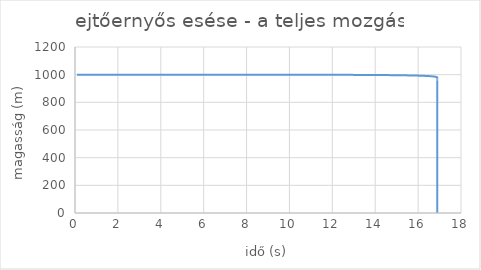
| Category | Series 0 |
|---|---|
| 0.09784999999999999 | 1000 |
| 0.19364145615175 | 1000 |
| 0.28746007160099024 | 1000 |
| 0.37938627144739057 | 1000 |
| 0.4694956294951315 | 1000 |
| 0.5578592525672859 | 1000 |
| 0.6445441273643155 | 1000 |
| 0.7296134341764717 | 1000 |
| 0.8131268311908 | 1000 |
| 0.8951407126488413 | 999.999 |
| 0.9757084436970991 | 999.999 |
| 1.0548805744175338 | 999.999 |
| 1.1327050352203816 | 999.999 |
| 1.2092273155186983 | 999.999 |
| 1.2844906273768006 | 999.999 |
| 1.358536055627824 | 999.999 |
| 1.4314026957844965 | 999.999 |
| 1.5031277809181567 | 999.998 |
| 1.5737467985508973 | 999.998 |
| 1.6432935984918067 | 999.998 |
| 1.711800492448377 | 999.998 |
| 1.7792983461563272 | 999.998 |
| 1.8458166646937435 | 999.998 |
| 1.9113836715771613 | 999.997 |
| 1.9760263821768473 | 999.997 |
| 2.0397706719350444 | 999.997 |
| 2.102641339823463 | 999.997 |
| 2.1646621674340842 | 999.996 |
| 2.225855974059738 | 999.996 |
| 2.286244668087353 | 999.996 |
| 2.345849294996809 | 999.996 |
| 2.4046900822314594 | 999.996 |
| 2.4627864811823486 | 999.995 |
| 2.520157206506535 | 999.995 |
| 2.5768202729805116 | 999.995 |
| 2.6327930300722184 | 999.994 |
| 2.688092194399391 | 999.994 |
| 2.7427338802277306 | 999.994 |
| 2.7967336281495254 | 999.994 |
| 2.850106432071698 | 999.993 |
| 2.9028667646316957 | 999.993 |
| 2.9550286011500657 | 999.993 |
| 3.006605442219837 | 999.992 |
| 3.0576103350249406 | 999.992 |
| 3.108055893472663 | 999.992 |
| 3.1579543172185853 | 999.991 |
| 3.2073174096564396 | 999.991 |
| 3.256156594939859 | 999.991 |
| 3.3044829340979707 | 999.99 |
| 3.3523071403022153 | 999.99 |
| 3.3996395933375605 | 999.989 |
| 3.4464903533274347 | 999.989 |
| 3.492869173758167 | 999.989 |
| 3.538785513845473 | 999.988 |
| 3.584248550282532 | 999.988 |
| 3.6292671884064642 | 999.987 |
| 3.6738500728174666 | 999.987 |
| 3.718005597482547 | 999.987 |
| 3.761741915353628 | 999.986 |
| 3.8050669475278034 | 999.986 |
| 3.847988391975706 | 999.985 |
| 3.890513731862215 | 999.985 |
| 3.9326502434821844 | 999.984 |
| 3.9744050038323984 | 999.984 |
| 4.015784897839612 | 999.983 |
| 4.056796625263278 | 999.983 |
| 4.0974467072904055 | 999.983 |
| 4.137741492838893 | 999.982 |
| 4.177687164584703 | 999.982 |
| 4.217289744727268 | 999.981 |
| 4.256555100506704 | 999.981 |
| 4.295488949485525 | 999.98 |
| 4.334096864606866 | 999.98 |
| 4.372384279040466 | 999.979 |
| 4.410356490827024 | 999.979 |
| 4.448018667330931 | 999.978 |
| 4.485375849510802 | 999.977 |
| 4.5224329560166785 | 999.977 |
| 4.559194787122312 | 999.976 |
| 4.595666028500412 | 999.976 |
| 4.6318512548483595 | 999.975 |
| 4.667754933371428 | 999.975 |
| 4.7033814271302 | 999.974 |
| 4.738734998258487 | 999.974 |
| 4.7738198110577255 | 999.973 |
| 4.8086399349735 | 999.972 |
| 4.8431993474595565 | 999.972 |
| 4.877501936734366 | 999.971 |
| 4.911551504435054 | 999.971 |
| 4.945351768173247 | 999.97 |
| 4.978906363997165 | 999.969 |
| 5.012218848764056 | 999.969 |
| 5.045292702426871 | 999.968 |
| 5.078131330238877 | 999.968 |
| 5.110738064879715 | 999.967 |
| 5.1431161685062525 | 999.966 |
| 5.1752688347313915 | 999.966 |
| 5.207199190533862 | 999.965 |
| 5.238910298101869 | 999.964 |
| 5.2704051566133225 | 999.964 |
| 5.3016867039552595 | 999.963 |
| 5.3327578183849305 | 999.962 |
| 5.363621320134916 | 999.962 |
| 5.394279972964526 | 999.961 |
| 5.424736485659616 | 999.96 |
| 5.454993513482882 | 999.96 |
| 5.485053659576573 | 999.959 |
| 5.514919476319491 | 999.958 |
| 5.544593466640057 | 999.957 |
| 5.574078085287134 | 999.957 |
| 5.603375740060234 | 999.956 |
| 5.632488793000665 | 999.955 |
| 5.6614195615450775 | 999.955 |
| 5.690170319642856 | 999.954 |
| 5.7187432988386835 | 999.953 |
| 5.747140689321586 | 999.952 |
| 5.775364640941701 | 999.952 |
| 5.803417264195939 | 999.951 |
| 5.831300631183693 | 999.95 |
| 5.859016776533669 | 999.949 |
| 5.88656769830289 | 999.948 |
| 5.913955358848857 | 999.948 |
| 5.941181685675842 | 999.947 |
| 5.968248572256213 | 999.946 |
| 5.995157878827681 | 999.945 |
| 6.021911433167304 | 999.945 |
| 6.048511031343069 | 999.944 |
| 6.074958438443812 | 999.943 |
| 6.101255389288232 | 999.942 |
| 6.127403589113718 | 999.941 |
| 6.15340471424566 | 999.94 |
| 6.1792604127479205 | 999.94 |
| 6.204972305055088 | 999.939 |
| 6.230541984587132 | 999.938 |
| 6.255971018347037 | 999.937 |
| 6.281260947501981 | 999.936 |
| 6.306413287948599 | 999.935 |
| 6.331429530862855 | 999.934 |
| 6.35631114323502 | 999.934 |
| 6.38105956839024 | 999.933 |
| 6.405676226495154 | 999.932 |
| 6.4301625150510135 | 999.931 |
| 6.454519809373731 | 999.93 |
| 6.478749463061272 | 999.929 |
| 6.502852808448782 | 999.928 |
| 6.526831157051854 | 999.927 |
| 6.550685799998272 | 999.926 |
| 6.574418008448625 | 999.925 |
| 6.598029034006108 | 999.925 |
| 6.621520109115852 | 999.924 |
| 6.6448924474541045 | 999.923 |
| 6.668147244307566 | 999.922 |
| 6.691285676943173 | 999.921 |
| 6.714308904968638 | 999.92 |
| 6.737218070683987 | 999.919 |
| 6.760014299424399 | 999.918 |
| 6.78269869989458 | 999.917 |
| 6.805272364494934 | 999.916 |
| 6.827736369639763 | 999.915 |
| 6.85009177606774 | 999.914 |
| 6.872339629144864 | 999.913 |
| 6.894480959160132 | 999.912 |
| 6.916516781614121 | 999.911 |
| 6.938448097500691 | 999.91 |
| 6.960275893582016 | 999.909 |
| 6.982001142657099 | 999.908 |
| 7.003624803824 | 999.907 |
| 7.025147822735911 | 999.906 |
| 7.046571131851285 | 999.905 |
| 7.067895650678152 | 999.904 |
| 7.0891222860128185 | 999.903 |
| 7.110251932173068 | 999.902 |
| 7.131285471226049 | 999.901 |
| 7.152223773210964 | 999.9 |
| 7.173067696356725 | 999.899 |
| 7.1938180872947 | 999.898 |
| 7.214475781266683 | 999.897 |
| 7.235041602328219 | 999.895 |
| 7.25551636354741 | 999.894 |
| 7.2759008671993115 | 999.893 |
| 7.296195904956052 | 999.892 |
| 7.316402258072775 | 999.891 |
| 7.336520697569519 | 999.89 |
| 7.3565519844091405 | 999.889 |
| 7.376496869671387 | 999.888 |
| 7.396356094723207 | 999.887 |
| 7.416130391385414 | 999.885 |
| 7.435820482095775 | 999.884 |
| 7.455427080068642 | 999.883 |
| 7.47495088945118 | 999.882 |
| 7.4943926054763175 | 999.881 |
| 7.513752914612466 | 999.88 |
| 7.533032494710114 | 999.879 |
| 7.552232015145365 | 999.877 |
| 7.57135213696049 | 999.876 |
| 7.590393513001584 | 999.875 |
| 7.609356788053379 | 999.874 |
| 7.628242598971302 | 999.873 |
| 7.647051574810829 | 999.872 |
| 7.665784336954218 | 999.87 |
| 7.684441499234663 | 999.869 |
| 7.7030236680579565 | 999.868 |
| 7.721531442521701 | 999.867 |
| 7.739965414532137 | 999.866 |
| 7.758326168918645 | 999.864 |
| 7.776614283545969 | 999.863 |
| 7.794830329424233 | 999.862 |
| 7.8129748708167766 | 999.861 |
| 7.831048465345888 | 999.859 |
| 7.849051664096465 | 999.858 |
| 7.86698501171766 | 999.857 |
| 7.884849046522558 | 999.856 |
| 7.902644300585923 | 999.854 |
| 7.92037129984007 | 999.853 |
| 7.938030564168904 | 999.852 |
| 7.955622607500149 | 999.851 |
| 7.973147937895843 | 999.849 |
| 7.990607057641102 | 999.848 |
| 8.008000463331223 | 999.847 |
| 8.025328645957137 | 999.845 |
| 8.042592090989269 | 999.844 |
| 8.059791278459835 | 999.843 |
| 8.076926683043606 | 999.842 |
| 8.093998774137173 | 999.84 |
| 8.111008015936756 | 999.839 |
| 8.12795486751458 | 999.838 |
| 8.144839782893852 | 999.836 |
| 8.161663211122372 | 999.835 |
| 8.1784255963448 | 999.834 |
| 8.195127377873622 | 999.832 |
| 8.211768990258829 | 999.831 |
| 8.228350863356345 | 999.829 |
| 8.244873422395232 | 999.828 |
| 8.261337088043685 | 999.827 |
| 8.277742276473866 | 999.825 |
| 8.294089399425582 | 999.824 |
| 8.310378864268834 | 999.823 |
| 8.326611074065278 | 999.821 |
| 8.34278642762859 | 999.82 |
| 8.358905319583796 | 999.818 |
| 8.374968140425548 | 999.817 |
| 8.390975276575404 | 999.816 |
| 8.406927110438112 | 999.814 |
| 8.422824020456925 | 999.813 |
| 8.438666381167964 | 999.811 |
| 8.454454563253648 | 999.81 |
| 8.47018893359522 | 999.808 |
| 8.48586985532437 | 999.807 |
| 8.501497687874002 | 999.806 |
| 8.51707278702811 | 999.804 |
| 8.532595504970859 | 999.803 |
| 8.548066190334797 | 999.801 |
| 8.563485188248302 | 999.8 |
| 8.57885284038221 | 999.798 |
| 8.594169484995676 | 999.797 |
| 8.609435456981291 | 999.795 |
| 8.624651087909431 | 999.794 |
| 8.639816706071892 | 999.792 |
| 8.65493263652481 | 999.791 |
| 8.669999201130873 | 999.789 |
| 8.685016718600847 | 999.788 |
| 8.699985504534439 | 999.786 |
| 8.714905871460482 | 999.785 |
| 8.729778128876488 | 999.783 |
| 8.74460258328755 | 999.782 |
| 8.75937953824464 | 999.78 |
| 8.774109294382278 | 999.779 |
| 8.788792149455608 | 999.777 |
| 8.80342839837689 | 999.776 |
| 8.81801833325141 | 999.774 |
| 8.832562243412825 | 999.773 |
| 8.84706041545795 | 999.771 |
| 8.861513133281006 | 999.769 |
| 8.875920678107331 | 999.768 |
| 8.890283328526564 | 999.766 |
| 8.904601360525318 | 999.765 |
| 8.918875047519336 | 999.763 |
| 8.933104660385172 | 999.761 |
| 8.947290467491369 | 999.76 |
| 8.961432734729158 | 999.758 |
| 8.9755317255427 | 999.757 |
| 8.989587700958856 | 999.755 |
| 9.003600919616513 | 999.753 |
| 9.017571637795463 | 999.752 |
| 9.03150010944484 | 999.75 |
| 9.04538658621114 | 999.749 |
| 9.059231317465816 | 999.747 |
| 9.073034550332451 | 999.745 |
| 9.086796529713547 | 999.744 |
| 9.100517498316893 | 999.742 |
| 9.114197696681558 | 999.74 |
| 9.127837363203488 | 999.739 |
| 9.141436734160738 | 999.737 |
| 9.154996043738326 | 999.735 |
| 9.168515524052719 | 999.734 |
| 9.181995405175972 | 999.732 |
| 9.195435915159505 | 999.73 |
| 9.208837280057546 | 999.729 |
| 9.22219972395022 | 999.727 |
| 9.23552346896632 | 999.725 |
| 9.248808735305737 | 999.723 |
| 9.262055741261577 | 999.722 |
| 9.275264703241959 | 999.72 |
| 9.288435835791502 | 999.718 |
| 9.3015693516125 | 999.717 |
| 9.31466546158581 | 999.715 |
| 9.327724374791428 | 999.713 |
| 9.340746298528794 | 999.711 |
| 9.35373143833679 | 999.71 |
| 9.366679998013478 | 999.708 |
| 9.379592179635539 | 999.706 |
| 9.392468183577465 | 999.704 |
| 9.405308208530473 | 999.702 |
| 9.418112451521145 | 999.701 |
| 9.430881107929833 | 999.699 |
| 9.443614371508797 | 999.697 |
| 9.456312434400086 | 999.695 |
| 9.468975487153195 | 999.694 |
| 9.481603718742457 | 999.692 |
| 9.49419731658422 | 999.69 |
| 9.506756466553767 | 999.688 |
| 9.51928135300203 | 999.686 |
| 9.531772158772059 | 999.684 |
| 9.544229065215275 | 999.683 |
| 9.556652252207513 | 999.681 |
| 9.569041898164835 | 999.679 |
| 9.581398180059143 | 999.677 |
| 9.593721273433573 | 999.675 |
| 9.606011352417696 | 999.673 |
| 9.618268589742504 | 999.672 |
| 9.630493156755215 | 999.67 |
| 9.64268522343386 | 999.668 |
| 9.6548449584017 | 999.666 |
| 9.666972528941438 | 999.664 |
| 9.679068101009246 | 999.662 |
| 9.691131839248627 | 999.66 |
| 9.703163907004063 | 999.658 |
| 9.715164466334523 | 999.657 |
| 9.727133678026764 | 999.655 |
| 9.739071701608482 | 999.653 |
| 9.75097869536128 | 999.651 |
| 9.762854816333475 | 999.649 |
| 9.77470022035274 | 999.647 |
| 9.786515062038585 | 999.645 |
| 9.798299494814678 | 999.643 |
| 9.810053670921006 | 999.641 |
| 9.821777741425883 | 999.639 |
| 9.833471856237814 | 999.637 |
| 9.845136164117195 | 999.635 |
| 9.856770812687872 | 999.633 |
| 9.868375948448564 | 999.631 |
| 9.879951716784126 | 999.629 |
| 9.89149826197668 | 999.627 |
| 9.903015727216612 | 999.625 |
| 9.91450425461342 | 999.624 |
| 9.925963985206433 | 999.622 |
| 9.937395058975408 | 999.62 |
| 9.948797614850973 | 999.618 |
| 9.960171790724964 | 999.616 |
| 9.97151772346062 | 999.614 |
| 9.982835548902662 | 999.612 |
| 9.994125401887242 | 999.609 |
| 10.005387416251777 | 999.607 |
| 10.016621724844656 | 999.605 |
| 10.027828459534836 | 999.603 |
| 10.03900775122132 | 999.601 |
| 10.050159729842514 | 999.599 |
| 10.061284524385487 | 999.597 |
| 10.072382262895093 | 999.595 |
| 10.08345307248302 | 999.593 |
| 10.094497079336692 | 999.591 |
| 10.105514408728098 | 999.589 |
| 10.11650518502249 | 999.587 |
| 10.127469531686998 | 999.585 |
| 10.138407571299128 | 999.583 |
| 10.149319425555168 | 999.581 |
| 10.160205215278493 | 999.579 |
| 10.171065060427768 | 999.577 |
| 10.181899080105064 | 999.574 |
| 10.192707392563866 | 999.572 |
| 10.203490115217003 | 999.57 |
| 10.21424736464447 | 999.568 |
| 10.22497925660117 | 999.566 |
| 10.235685906024566 | 999.564 |
| 10.246367427042234 | 999.562 |
| 10.257023932979338 | 999.56 |
| 10.267655536366023 | 999.557 |
| 10.278262348944708 | 999.555 |
| 10.288844481677307 | 999.553 |
| 10.299402044752371 | 999.551 |
| 10.309935147592132 | 999.549 |
| 10.320443898859484 | 999.547 |
| 10.330928406464876 | 999.544 |
| 10.341388777573126 | 999.542 |
| 10.351825118610165 | 999.54 |
| 10.3622375352697 | 999.538 |
| 10.372626132519793 | 999.536 |
| 10.382991014609392 | 999.533 |
| 10.393332285074758 | 999.531 |
| 10.403650046745843 | 999.529 |
| 10.413944401752586 | 999.527 |
| 10.424215451531138 | 999.525 |
| 10.43446329683003 | 999.522 |
| 10.444688037716253 | 999.52 |
| 10.45488977358129 | 999.518 |
| 10.465068603147069 | 999.516 |
| 10.475224624471858 | 999.513 |
| 10.485357934956092 | 999.511 |
| 10.495468631348132 | 999.509 |
| 10.505556809749969 | 999.507 |
| 10.51562256562286 | 999.504 |
| 10.525665993792908 | 999.502 |
| 10.535687188456576 | 999.5 |
| 10.545686243186145 | 999.498 |
| 10.555663250935108 | 999.495 |
| 10.565618304043513 | 999.493 |
| 10.575551494243243 | 999.491 |
| 10.585462912663242 | 999.488 |
| 10.595352649834686 | 999.486 |
| 10.605220795696091 | 999.484 |
| 10.61506743959838 | 999.482 |
| 10.624892670309883 | 999.479 |
| 10.634696576021293 | 999.477 |
| 10.644479244350562 | 999.475 |
| 10.654240762347753 | 999.472 |
| 10.663981216499835 | 999.47 |
| 10.673700692735428 | 999.468 |
| 10.683399276429505 | 999.465 |
| 10.693077052408032 | 999.463 |
| 10.702734104952574 | 999.46 |
| 10.712370517804839 | 999.458 |
| 10.721986374171186 | 999.456 |
| 10.73158175672708 | 999.453 |
| 10.741156747621503 | 999.451 |
| 10.750711428481315 | 999.449 |
| 10.760245880415582 | 999.446 |
| 10.76976018401984 | 999.444 |
| 10.779254419380333 | 999.441 |
| 10.788728666078205 | 999.439 |
| 10.798183003193634 | 999.437 |
| 10.807617509309939 | 999.434 |
| 10.817032262517644 | 999.432 |
| 10.826427340418496 | 999.429 |
| 10.83580282012944 | 999.427 |
| 10.845158778286558 | 999.425 |
| 10.854495291048975 | 999.422 |
| 10.863812434102703 | 999.42 |
| 10.873110282664477 | 999.417 |
| 10.882388911485526 | 999.415 |
| 10.891648394855322 | 999.412 |
| 10.900888806605284 | 999.41 |
| 10.91011022011245 | 999.407 |
| 10.919312708303108 | 999.405 |
| 10.92849634365639 | 999.402 |
| 10.937661198207836 | 999.4 |
| 10.946807343552925 | 999.397 |
| 10.955934850850552 | 999.395 |
| 10.965043790826497 | 999.392 |
| 10.974134233776844 | 999.39 |
| 10.983206249571367 | 999.387 |
| 10.992259907656889 | 999.385 |
| 11.0012952770606 | 999.382 |
| 11.01031242639335 | 999.38 |
| 11.019311423852912 | 999.377 |
| 11.0282923372272 | 999.375 |
| 11.037255233897469 | 999.372 |
| 11.046200180841478 | 999.37 |
| 11.055127244636624 | 999.367 |
| 11.064036491463048 | 999.365 |
| 11.072927987106702 | 999.362 |
| 11.081801796962399 | 999.36 |
| 11.090657986036826 | 999.357 |
| 11.099496618951527 | 999.354 |
| 11.108317759945868 | 999.352 |
| 11.117121472879957 | 999.349 |
| 11.12590782123755 | 999.347 |
| 11.134676868128928 | 999.344 |
| 11.143428676293738 | 999.341 |
| 11.152163308103814 | 999.339 |
| 11.160880825565973 | 999.336 |
| 11.169581290324778 | 999.334 |
| 11.178264763665283 | 999.331 |
| 11.186931306515742 | 999.328 |
| 11.195580979450305 | 999.326 |
| 11.20421384269168 | 999.323 |
| 11.212829956113767 | 999.321 |
| 11.221429379244286 | 999.318 |
| 11.230012171267356 | 999.315 |
| 11.238578391026065 | 999.313 |
| 11.247128097025016 | 999.31 |
| 11.255661347432842 | 999.307 |
| 11.264178200084707 | 999.305 |
| 11.272678712484776 | 999.302 |
| 11.281162941808667 | 999.299 |
| 11.289630944905875 | 999.297 |
| 11.298082778302186 | 999.294 |
| 11.306518498202054 | 999.291 |
| 11.314938160490968 | 999.289 |
| 11.323341820737785 | 999.286 |
| 11.33172953419706 | 999.283 |
| 11.340101355811337 | 999.28 |
| 11.348457340213429 | 999.278 |
| 11.356797541728676 | 999.275 |
| 11.36512201437718 | 999.272 |
| 11.373430811876021 | 999.27 |
| 11.38172398764146 | 999.267 |
| 11.390001594791105 | 999.264 |
| 11.39826368614608 | 999.261 |
| 11.406510314233158 | 999.259 |
| 11.414741531286877 | 999.256 |
| 11.422957389251648 | 999.253 |
| 11.431157939783832 | 999.25 |
| 11.511637838884372 | 999.222 |
| 11.590642755172807 | 999.194 |
| 11.668220569414597 | 999.165 |
| 11.744416609537813 | 999.135 |
| 11.819273824472308 | 999.105 |
| 11.892832943628157 | 999.075 |
| 11.965132623433588 | 999.044 |
| 12.03620958219068 | 999.012 |
| 12.106098724365872 | 998.98 |
| 12.174833255308894 | 998.948 |
| 12.24244478728553 | 998.915 |
| 12.308963437614754 | 998.882 |
| 12.374417919617162 | 998.848 |
| 12.43883562700807 | 998.813 |
| 12.502242712303508 | 998.779 |
| 12.564664159749883 | 998.743 |
| 12.626123853236987 | 998.708 |
| 12.686644639608735 | 998.672 |
| 12.746248387745768 | 998.635 |
| 12.804956043758077 | 998.598 |
| 12.862787682593847 | 998.561 |
| 12.919762556342052 | 998.523 |
| 12.97589913948076 | 998.484 |
| 13.031215171300158 | 998.446 |
| 13.085727695708735 | 998.406 |
| 13.139453098612575 | 998.367 |
| 13.192407143041105 | 998.327 |
| 13.24460500217768 | 998.286 |
| 13.29606129043993 | 998.245 |
| 13.346790092742602 | 998.204 |
| 13.396804992064673 | 998.162 |
| 13.446119095432596 | 998.12 |
| 13.494745058422522 | 998.077 |
| 13.54269510827627 | 998.034 |
| 13.58998106571837 | 997.991 |
| 13.636614365554884 | 997.947 |
| 13.68260607612858 | 997.903 |
| 13.727966917699538 | 997.858 |
| 13.772707279815211 | 997.813 |
| 13.816837237729423 | 997.768 |
| 13.860366567925542 | 997.722 |
| 13.903304762795313 | 997.676 |
| 13.945661044521298 | 997.629 |
| 13.987444378207684 | 997.582 |
| 14.028663484301328 | 997.535 |
| 14.069326850342152 | 997.488 |
| 14.109442742079603 | 997.44 |
| 14.14901921398956 | 997.391 |
| 14.188064119224022 | 997.343 |
| 14.226585119023948 | 997.293 |
| 14.264589691623845 | 997.244 |
| 14.302085140675045 | 997.194 |
| 14.33907860321308 | 997.144 |
| 14.375577057193144 | 997.094 |
| 14.411587328616289 | 997.043 |
| 14.447116098267792 | 996.992 |
| 14.482169908087968 | 996.941 |
| 14.516755167194624 | 996.889 |
| 14.55087815757535 | 996.837 |
| 14.584545039466898 | 996.785 |
| 14.617761856438019 | 996.732 |
| 14.650534540191272 | 996.68 |
| 14.682868915098569 | 996.626 |
| 14.714770702484461 | 996.573 |
| 14.74624552467048 | 996.519 |
| 14.777298908793162 | 996.465 |
| 14.80793629040782 | 996.411 |
| 14.838163016889474 | 996.356 |
| 14.867984350641816 | 996.301 |
| 14.89740547212457 | 996.246 |
| 14.92643148270907 | 996.191 |
| 14.955067407371422 | 996.135 |
| 14.98331819723214 | 996.08 |
| 15.011188731950753 | 996.023 |
| 15.038683821983383 | 995.967 |
| 15.065808210711005 | 995.91 |
| 15.092566576445625 | 995.854 |
| 15.118963534321326 | 995.797 |
| 15.14500363807674 | 995.739 |
| 15.17069138173521 | 995.682 |
| 15.19603120118856 | 995.624 |
| 15.221027475690134 | 995.566 |
| 15.24568452926244 | 995.508 |
| 15.270006632024495 | 995.449 |
| 15.293998001443667 | 995.391 |
| 15.31766280351662 | 995.332 |
| 15.341005153883676 | 995.273 |
| 15.364029118880696 | 995.214 |
| 15.386738716532394 | 995.155 |
| 15.409137917490755 | 995.095 |
| 15.431230645922048 | 995.035 |
| 15.45302078034573 | 994.975 |
| 15.474512154428377 | 994.915 |
| 15.495708557735563 | 994.855 |
| 15.516613736444505 | 994.794 |
| 15.537231394020072 | 994.734 |
| 15.557565191856664 | 994.673 |
| 15.57761874988829 | 994.612 |
| 15.597395647169044 | 994.551 |
| 15.616899422426066 | 994.49 |
| 15.636133574586932 | 994.428 |
| 15.655101563283324 | 994.367 |
| 15.673806809332692 | 994.305 |
| 15.692252695199535 | 994.243 |
| 15.710442565437837 | 994.181 |
| 15.728379727116062 | 994.119 |
| 15.74606745022606 | 994.057 |
| 15.763508968077138 | 993.994 |
| 15.780707477676465 | 993.932 |
| 15.797666140096888 | 993.869 |
| 15.814388080833218 | 993.806 |
| 15.830876390147898 | 993.743 |
| 15.847134123406969 | 993.68 |
| 15.863164301407151 | 993.617 |
| 15.878969910694808 | 993.554 |
| 15.894553903877501 | 993.49 |
| 15.909919199928808 | 993.427 |
| 15.925068684487014 | 993.363 |
| 15.94000521014823 | 993.3 |
| 15.954731596754478 | 993.236 |
| 15.969250631677205 | 993.172 |
| 15.983565070096706 | 993.108 |
| 15.997677635277805 | 993.044 |
| 16.011591018842232 | 992.98 |
| 16.025307881037985 | 992.915 |
| 16.03883085100602 | 992.851 |
| 16.05216252704453 | 992.786 |
| 16.06530547687111 | 992.722 |
| 16.078262237882978 | 992.657 |
| 16.09103531741552 | 992.592 |
| 16.103627192999326 | 992.528 |
| 16.11604031261587 | 992.463 |
| 16.128277094952004 | 992.398 |
| 16.14033992965341 | 992.333 |
| 16.15223117757709 | 992.268 |
| 16.163953171043016 | 992.202 |
| 16.175508214085053 | 992.137 |
| 16.18689858270118 | 992.072 |
| 16.198126525103113 | 992.006 |
| 16.209194261965376 | 991.941 |
| 16.22010398667383 | 991.875 |
| 16.230857865573757 | 991.81 |
| 16.24145803821746 | 991.744 |
| 16.251906617611436 | 991.678 |
| 16.262205690463123 | 991.613 |
| 16.272357317427215 | 991.547 |
| 16.282363533351567 | 991.481 |
| 16.292226347522664 | 991.415 |
| 16.301947743910638 | 991.349 |
| 16.311529681413845 | 991.283 |
| 16.320974094102954 | 991.217 |
| 16.330282891464545 | 991.151 |
| 16.339457958644175 | 991.084 |
| 16.348501156688908 | 991.018 |
| 16.357414322789236 | 990.952 |
| 16.366199270520422 | 990.885 |
| 16.37485779008316 | 990.819 |
| 16.383391648543576 | 990.753 |
| 16.391802590072505 | 990.686 |
| 16.40009233618401 | 990.62 |
| 16.408262585973105 | 990.553 |
| 16.41631501635265 | 990.486 |
| 16.424251282289394 | 990.42 |
| 16.43207301703906 | 990.353 |
| 16.43978183238055 | 990.286 |
| 16.447379318849123 | 990.22 |
| 16.45486704596855 | 990.153 |
| 16.462246562482242 | 990.086 |
| 16.469519396583237 | 990.019 |
| 16.4766870561431 | 989.952 |
| 16.48375102893961 | 989.885 |
| 16.490712782883293 | 989.818 |
| 16.497573766242667 | 989.751 |
| 16.50433540786826 | 989.684 |
| 16.510999117415306 | 989.617 |
| 16.517566285565092 | 989.55 |
| 16.524038284244988 | 989.483 |
| 16.530416466847036 | 989.416 |
| 16.536702168445153 | 989.349 |
| 16.542896706010865 | 989.281 |
| 16.54900137862758 | 989.214 |
| 16.555017467703365 | 989.147 |
| 16.560946237182197 | 989.08 |
| 16.56678893375367 | 989.012 |
| 16.572546787061146 | 988.945 |
| 16.578221009908315 | 988.878 |
| 16.58381279846415 | 988.81 |
| 16.589323332466257 | 988.743 |
| 16.59475377542256 | 988.676 |
| 16.600105274811362 | 988.608 |
| 16.605378962279723 | 988.541 |
| 16.610575953840158 | 988.473 |
| 16.615697350065645 | 988.406 |
| 16.620744236282935 | 988.338 |
| 16.625717682764133 | 988.271 |
| 16.63061874491657 | 988.203 |
| 16.63544846347094 | 988.136 |
| 16.64020786466768 | 988.068 |
| 16.644897960441632 | 988.001 |
| 16.649519748604945 | 987.933 |
| 16.65407421302821 | 987.865 |
| 16.658562323819847 | 987.798 |
| 16.662985037503727 | 987.73 |
| 16.667343297195032 | 987.663 |
| 16.67163803277435 | 987.595 |
| 16.67587016106 | 987.527 |
| 16.680040585978595 | 987.46 |
| 16.684150198733843 | 987.392 |
| 16.688199877973574 | 987.324 |
| 16.692190489955028 | 987.256 |
| 16.696122888708366 | 987.189 |
| 16.699997916198438 | 987.121 |
| 16.703816402484794 | 987.053 |
| 16.707579165879956 | 986.985 |
| 16.711287013105952 | 986.918 |
| 16.71494073944912 | 986.85 |
| 16.718541128913163 | 986.782 |
| 16.722088954370523 | 986.714 |
| 16.725584977712 | 986.646 |
| 16.7290299499947 | 986.578 |
| 16.73242461158827 | 986.511 |
| 16.735769692319447 | 986.443 |
| 16.739065911614922 | 986.375 |
| 16.74231397864256 | 986.307 |
| 16.745514592450924 | 986.239 |
| 16.748668442107178 | 986.171 |
| 16.751776206833338 | 986.103 |
| 16.754838556140893 | 986.035 |
| 16.75785614996382 | 985.967 |
| 16.760829638789982 | 985.9 |
| 16.76375966379092 | 985.832 |
| 16.766646856950103 | 985.764 |
| 16.76949184118955 | 985.696 |
| 16.772295230494937 | 985.628 |
| 16.775057630039143 | 985.56 |
| 16.777779636304256 | 985.492 |
| 16.780461837202058 | 985.424 |
| 16.78310481219301 | 985.356 |
| 16.78570913240373 | 985.288 |
| 16.788275360743 | 985.22 |
| 16.790804052016284 | 985.152 |
| 16.79329575303881 | 985.084 |
| 16.795751002747192 | 985.016 |
| 16.79817033230964 | 984.948 |
| 16.800554265234727 | 984.88 |
| 16.802903317478783 | 984.812 |
| 16.805217997551875 | 984.744 |
| 16.807498806622423 | 984.676 |
| 16.809746238620455 | 984.608 |
| 16.81196078033951 | 984.54 |
| 16.8141429115372 | 984.472 |
| 16.816293105034465 | 984.404 |
| 16.81841182681351 | 984.336 |
| 16.82049953611445 | 984.268 |
| 16.822556685530685 | 984.2 |
| 16.824583721102986 | 984.132 |
| 16.826581082412357 | 984.063 |
| 16.82854920267164 | 983.995 |
| 16.830488508815893 | 983.927 |
| 16.832399421591575 | 983.859 |
| 16.834282355644508 | 983.791 |
| 16.836137719606675 | 983.723 |
| 16.837965916181833 | 983.655 |
| 16.839767342229983 | 983.587 |
| 16.841542388850677 | 983.519 |
| 16.843291441465205 | 983.451 |
| 16.845014879897676 | 983.383 |
| 16.84671307845496 | 983.315 |
| 16.84838640600558 | 983.246 |
| 16.85003522605749 | 983.178 |
| 16.8516598968348 | 983.11 |
| 16.85326077135347 | 983.042 |
| 16.854838197495912 | 982.974 |
| 16.85639251808463 | 982.906 |
| 16.857924070954777 | 982.838 |
| 16.859433189025772 | 982.77 |
| 16.86092020037188 | 982.702 |
| 16.86238542829183 | 982.633 |
| 16.863829191377487 | 982.565 |
| 16.86525180358153 | 982.497 |
| 16.866653574284218 | 982.429 |
| 16.86803480835923 | 982.361 |
| 16.86939580623856 | 982.293 |
| 16.870736863976525 | 982.225 |
| 16.888668746832217 | 978.814 |
| 16.893449693440324 | 975.404 |
| 16.894726060648168 | 971.994 |
| 16.895066599666276 | 968.584 |
| 16.89515748295717 | 965.174 |
| 16.89518173467345 | 961.764 |
| 16.895188206521286 | 958.354 |
| 16.895189933557116 | 954.944 |
| 16.895190394429147 | 951.534 |
| 16.8951905174154 | 948.124 |
| 16.895190550235064 | 944.714 |
| 16.895190558993185 | 941.304 |
| 16.895190561330345 | 937.894 |
| 16.89519056195403 | 934.484 |
| 16.895190562120465 | 931.074 |
| 16.895190562164878 | 927.664 |
| 16.89519056217673 | 924.254 |
| 16.89519056217989 | 920.845 |
| 16.895190562180737 | 917.435 |
| 16.89519056218096 | 914.025 |
| 16.89519056218102 | 910.615 |
| 16.89519056218104 | 907.205 |
| 16.895190562181043 | 903.795 |
| 16.895190562181043 | 900.385 |
| 16.895190562181043 | 896.975 |
| 16.895190562181043 | 893.565 |
| 16.895190562181043 | 890.155 |
| 16.895190562181043 | 886.745 |
| 16.895190562181043 | 883.335 |
| 16.895190562181043 | 879.925 |
| 16.895190562181043 | 876.515 |
| 16.895190562181043 | 873.105 |
| 16.895190562181043 | 869.695 |
| 16.895190562181043 | 866.285 |
| 16.895190562181043 | 862.875 |
| 16.895190562181043 | 859.465 |
| 16.895190562181043 | 856.055 |
| 16.895190562181043 | 852.645 |
| 16.895190562181043 | 849.235 |
| 16.895190562181043 | 845.825 |
| 16.895190562181043 | 842.415 |
| 16.895190562181043 | 839.005 |
| 16.895190562181043 | 835.595 |
| 16.895190562181043 | 832.185 |
| 16.895190562181043 | 828.775 |
| 16.895190562181043 | 825.365 |
| 16.895190562181043 | 821.955 |
| 16.895190562181043 | 818.545 |
| 16.895190562181043 | 815.135 |
| 16.895190562181043 | 811.725 |
| 16.895190562181043 | 808.315 |
| 16.895190562181043 | 804.905 |
| 16.895190562181043 | 801.495 |
| 16.895190562181043 | 798.086 |
| 16.895190562181043 | 794.676 |
| 16.895190562181043 | 791.266 |
| 16.895190562181043 | 787.856 |
| 16.895190562181043 | 784.446 |
| 16.895190562181043 | 781.036 |
| 16.895190562181043 | 777.626 |
| 16.895190562181043 | 774.216 |
| 16.895190562181043 | 770.806 |
| 16.895190562181043 | 767.396 |
| 16.895190562181043 | 763.986 |
| 16.895190562181043 | 760.576 |
| 16.895190562181043 | 757.166 |
| 16.895190562181043 | 753.756 |
| 16.895190562181043 | 750.346 |
| 16.895190562181043 | 746.936 |
| 16.895190562181043 | 743.526 |
| 16.895190562181043 | 740.116 |
| 16.895190562181043 | 736.706 |
| 16.895190562181043 | 733.296 |
| 16.895190562181043 | 729.886 |
| 16.895190562181043 | 726.476 |
| 16.895190562181043 | 723.066 |
| 16.895190562181043 | 719.656 |
| 16.895190562181043 | 716.246 |
| 16.895190562181043 | 712.836 |
| 16.895190562181043 | 709.426 |
| 16.895190562181043 | 706.016 |
| 16.895190562181043 | 702.606 |
| 16.895190562181043 | 699.196 |
| 16.895190562181043 | 695.786 |
| 16.895190562181043 | 692.376 |
| 16.895190562181043 | 688.966 |
| 16.895190562181043 | 685.556 |
| 16.895190562181043 | 682.146 |
| 16.895190562181043 | 678.737 |
| 16.895190562181043 | 675.327 |
| 16.895190562181043 | 671.917 |
| 16.895190562181043 | 668.507 |
| 16.895190562181043 | 665.097 |
| 16.895190562181043 | 661.687 |
| 16.895190562181043 | 658.277 |
| 16.895190562181043 | 654.867 |
| 16.895190562181043 | 651.457 |
| 16.895190562181043 | 648.047 |
| 16.895190562181043 | 644.637 |
| 16.895190562181043 | 641.227 |
| 16.895190562181043 | 637.817 |
| 16.895190562181043 | 634.407 |
| 16.895190562181043 | 630.997 |
| 16.895190562181043 | 627.587 |
| 16.895190562181043 | 624.177 |
| 16.895190562181043 | 620.767 |
| 16.895190562181043 | 617.357 |
| 16.895190562181043 | 613.947 |
| 16.895190562181043 | 610.537 |
| 16.895190562181043 | 607.127 |
| 16.895190562181043 | 603.717 |
| 16.895190562181043 | 600.307 |
| 16.895190562181043 | 596.897 |
| 16.895190562181043 | 593.487 |
| 16.895190562181043 | 590.077 |
| 16.895190562181043 | 586.667 |
| 16.895190562181043 | 583.257 |
| 16.895190562181043 | 579.847 |
| 16.895190562181043 | 576.437 |
| 16.895190562181043 | 573.027 |
| 16.895190562181043 | 569.617 |
| 16.895190562181043 | 566.207 |
| 16.895190562181043 | 562.797 |
| 16.895190562181043 | 559.388 |
| 16.895190562181043 | 555.978 |
| 16.895190562181043 | 552.568 |
| 16.895190562181043 | 549.158 |
| 16.895190562181043 | 545.748 |
| 16.895190562181043 | 542.338 |
| 16.895190562181043 | 538.928 |
| 16.895190562181043 | 535.518 |
| 16.895190562181043 | 532.108 |
| 16.895190562181043 | 528.698 |
| 16.895190562181043 | 525.288 |
| 16.895190562181043 | 521.878 |
| 16.895190562181043 | 518.468 |
| 16.895190562181043 | 515.058 |
| 16.895190562181043 | 511.648 |
| 16.895190562181043 | 508.238 |
| 16.895190562181043 | 504.828 |
| 16.895190562181043 | 501.418 |
| 16.895190562181043 | 498.008 |
| 16.895190562181043 | 494.598 |
| 16.895190562181043 | 491.188 |
| 16.895190562181043 | 487.778 |
| 16.895190562181043 | 484.368 |
| 16.895190562181043 | 480.958 |
| 16.895190562181043 | 477.548 |
| 16.895190562181043 | 474.138 |
| 16.895190562181043 | 470.728 |
| 16.895190562181043 | 467.318 |
| 16.895190562181043 | 463.908 |
| 16.895190562181043 | 460.498 |
| 16.895190562181043 | 457.088 |
| 16.895190562181043 | 453.678 |
| 16.895190562181043 | 450.268 |
| 16.895190562181043 | 446.858 |
| 16.895190562181043 | 443.448 |
| 16.895190562181043 | 440.038 |
| 16.895190562181043 | 436.629 |
| 16.895190562181043 | 433.219 |
| 16.895190562181043 | 429.809 |
| 16.895190562181043 | 426.399 |
| 16.895190562181043 | 422.989 |
| 16.895190562181043 | 419.579 |
| 16.895190562181043 | 416.169 |
| 16.895190562181043 | 412.759 |
| 16.895190562181043 | 409.349 |
| 16.895190562181043 | 405.939 |
| 16.895190562181043 | 402.529 |
| 16.895190562181043 | 399.119 |
| 16.895190562181043 | 395.709 |
| 16.895190562181043 | 392.299 |
| 16.895190562181043 | 388.889 |
| 16.895190562181043 | 385.479 |
| 16.895190562181043 | 382.069 |
| 16.895190562181043 | 378.659 |
| 16.895190562181043 | 375.249 |
| 16.895190562181043 | 371.839 |
| 16.895190562181043 | 368.429 |
| 16.895190562181043 | 365.019 |
| 16.895190562181043 | 361.609 |
| 16.895190562181043 | 358.199 |
| 16.895190562181043 | 354.789 |
| 16.895190562181043 | 351.379 |
| 16.895190562181043 | 347.969 |
| 16.895190562181043 | 344.559 |
| 16.895190562181043 | 341.149 |
| 16.895190562181043 | 337.739 |
| 16.895190562181043 | 334.329 |
| 16.895190562181043 | 330.919 |
| 16.895190562181043 | 327.509 |
| 16.895190562181043 | 324.099 |
| 16.895190562181043 | 320.689 |
| 16.895190562181043 | 317.28 |
| 16.895190562181043 | 313.87 |
| 16.895190562181043 | 310.46 |
| 16.895190562181043 | 307.05 |
| 16.895190562181043 | 303.64 |
| 16.895190562181043 | 300.23 |
| 16.895190562181043 | 296.82 |
| 16.895190562181043 | 293.41 |
| 16.895190562181043 | 290 |
| 16.895190562181043 | 286.59 |
| 16.895190562181043 | 283.18 |
| 16.895190562181043 | 279.77 |
| 16.895190562181043 | 276.36 |
| 16.895190562181043 | 272.95 |
| 16.895190562181043 | 269.54 |
| 16.895190562181043 | 266.13 |
| 16.895190562181043 | 262.72 |
| 16.895190562181043 | 259.31 |
| 16.895190562181043 | 255.9 |
| 16.895190562181043 | 252.49 |
| 16.895190562181043 | 249.08 |
| 16.895190562181043 | 245.67 |
| 16.895190562181043 | 242.26 |
| 16.895190562181043 | 238.85 |
| 16.895190562181043 | 235.44 |
| 16.895190562181043 | 232.03 |
| 16.895190562181043 | 228.62 |
| 16.895190562181043 | 225.21 |
| 16.895190562181043 | 221.8 |
| 16.895190562181043 | 218.39 |
| 16.895190562181043 | 214.98 |
| 16.895190562181043 | 211.57 |
| 16.895190562181043 | 208.16 |
| 16.895190562181043 | 204.75 |
| 16.895190562181043 | 201.34 |
| 16.895190562181043 | 197.931 |
| 16.895190562181043 | 194.521 |
| 16.895190562181043 | 191.111 |
| 16.895190562181043 | 187.701 |
| 16.895190562181043 | 184.291 |
| 16.895190562181043 | 180.881 |
| 16.895190562181043 | 177.471 |
| 16.895190562181043 | 174.061 |
| 16.895190562181043 | 170.651 |
| 16.895190562181043 | 167.241 |
| 16.895190562181043 | 163.831 |
| 16.895190562181043 | 160.421 |
| 16.895190562181043 | 157.011 |
| 16.895190562181043 | 153.601 |
| 16.895190562181043 | 150.191 |
| 16.895190562181043 | 146.781 |
| 16.895190562181043 | 143.371 |
| 16.895190562181043 | 139.961 |
| 16.895190562181043 | 136.551 |
| 16.895190562181043 | 133.141 |
| 16.895190562181043 | 129.731 |
| 16.895190562181043 | 126.321 |
| 16.895190562181043 | 122.911 |
| 16.895190562181043 | 119.501 |
| 16.895190562181043 | 116.091 |
| 16.895190562181043 | 112.681 |
| 16.895190562181043 | 109.271 |
| 16.895190562181043 | 105.861 |
| 16.895190562181043 | 102.451 |
| 16.895190562181043 | 99.041 |
| 16.895190562181043 | 95.631 |
| 16.895190562181043 | 92.221 |
| 16.895190562181043 | 88.811 |
| 16.895190562181043 | 85.401 |
| 16.895190562181043 | 81.991 |
| 16.895190562181043 | 78.581 |
| 16.895190562181043 | 75.172 |
| 16.895190562181043 | 71.762 |
| 16.895190562181043 | 68.352 |
| 16.895190562181043 | 64.942 |
| 16.895190562181043 | 61.532 |
| 16.895190562181043 | 58.122 |
| 16.895190562181043 | 54.712 |
| 16.895190562181043 | 51.302 |
| 16.895190562181043 | 47.892 |
| 16.895190562181043 | 44.482 |
| 16.895190562181043 | 41.072 |
| 16.895190562181043 | 37.662 |
| 16.895190562181043 | 34.252 |
| 16.895190562181043 | 30.842 |
| 16.895190562181043 | 27.432 |
| 16.895190562181043 | 24.022 |
| 16.895190562181043 | 20.612 |
| 16.895190562181043 | 17.202 |
| 16.895190562181043 | 13.792 |
| 16.895190562181043 | 10.382 |
| 16.895190562181043 | 6.972 |
| 16.895190562181043 | 3.562 |
| 16.895190562181043 | 0.152 |